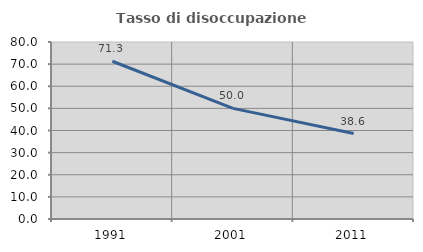
| Category | Tasso di disoccupazione giovanile  |
|---|---|
| 1991.0 | 71.295 |
| 2001.0 | 50 |
| 2011.0 | 38.636 |